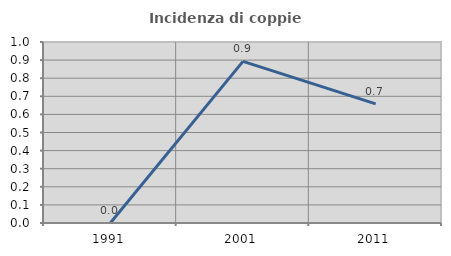
| Category | Incidenza di coppie miste |
|---|---|
| 1991.0 | 0 |
| 2001.0 | 0.893 |
| 2011.0 | 0.658 |